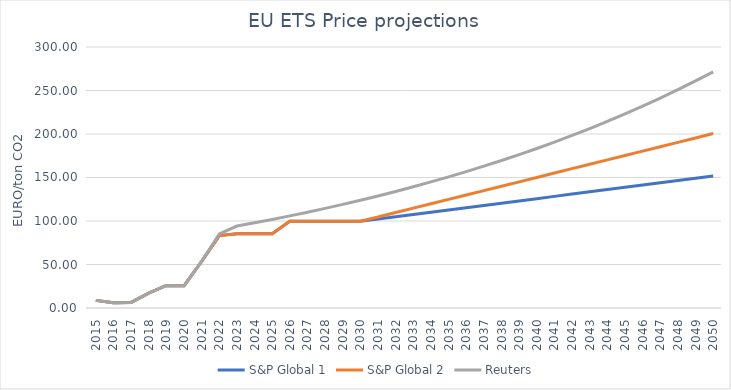
| Category | S&P Global 1 | S&P Global 2 | Reuters |
|---|---|---|---|
| 2015.0 | 8.774 | 8.774 | 8.774 |
| 2016.0 | 6.092 | 6.092 | 6.092 |
| 2017.0 | 6.445 | 6.445 | 6.445 |
| 2018.0 | 17.03 | 17.03 | 17.03 |
| 2019.0 | 25.951 | 25.951 | 25.951 |
| 2020.0 | 25.506 | 25.506 | 25.506 |
| 2021.0 | 53.652 | 53.652 | 53.652 |
| 2022.0 | 83.249 | 83.249 | 85.22 |
| 2023.0 | 85.45 | 85.45 | 94.23 |
| 2024.0 | 85.45 | 85.45 | 97.9 |
| 2025.0 | 85.45 | 85.45 | 101.816 |
| 2026.0 | 99.63 | 99.63 | 105.889 |
| 2027.0 | 99.63 | 99.63 | 110.124 |
| 2028.0 | 99.63 | 99.63 | 114.529 |
| 2029.0 | 99.63 | 99.63 | 119.11 |
| 2030.0 | 99.63 | 99.63 | 123.875 |
| 2031.0 | 102.236 | 104.673 | 128.83 |
| 2032.0 | 104.843 | 109.717 | 133.983 |
| 2033.0 | 107.449 | 114.76 | 139.342 |
| 2034.0 | 110.056 | 119.804 | 144.916 |
| 2035.0 | 112.662 | 124.847 | 150.713 |
| 2036.0 | 115.269 | 129.891 | 156.741 |
| 2037.0 | 117.875 | 134.934 | 163.011 |
| 2038.0 | 120.482 | 139.978 | 169.531 |
| 2039.0 | 123.088 | 145.021 | 176.312 |
| 2040.0 | 125.695 | 150.065 | 183.365 |
| 2041.0 | 128.301 | 155.108 | 190.699 |
| 2042.0 | 130.908 | 160.152 | 198.327 |
| 2043.0 | 133.514 | 165.195 | 206.261 |
| 2044.0 | 136.121 | 170.239 | 214.511 |
| 2045.0 | 138.728 | 175.282 | 223.091 |
| 2046.0 | 141.334 | 180.326 | 232.015 |
| 2047.0 | 143.941 | 185.369 | 241.296 |
| 2048.0 | 146.547 | 190.413 | 250.947 |
| 2049.0 | 149.154 | 195.456 | 260.985 |
| 2050.0 | 151.76 | 200.5 | 271.425 |